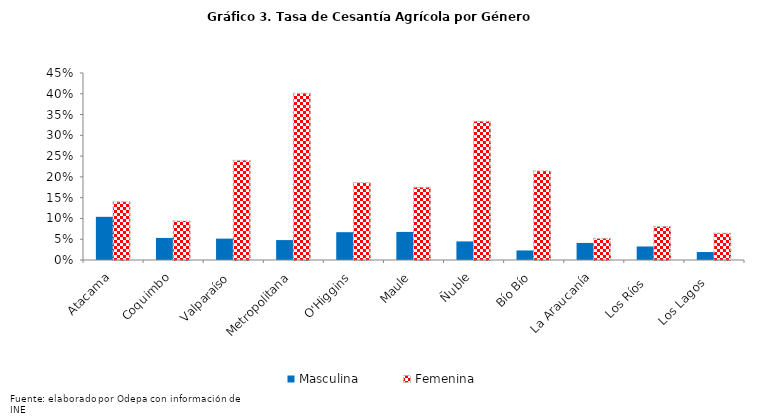
| Category | Masculina | Femenina |
|---|---|---|
| Atacama | 0.104 | 0.14 |
| Coquimbo | 0.053 | 0.094 |
| Valparaíso | 0.051 | 0.24 |
| Metropolitana | 0.048 | 0.401 |
| O'Higgins | 0.067 | 0.186 |
| Maule | 0.068 | 0.175 |
| Ñuble | 0.045 | 0.334 |
| Bío Bío | 0.023 | 0.214 |
| La Araucanía | 0.041 | 0.052 |
| Los Ríos   | 0.033 | 0.081 |
| Los Lagos   | 0.019 | 0.065 |